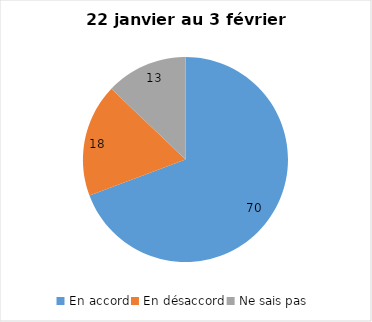
| Category | Series 0 |
|---|---|
| En accord | 70 |
| En désaccord | 18 |
| Ne sais pas | 13 |